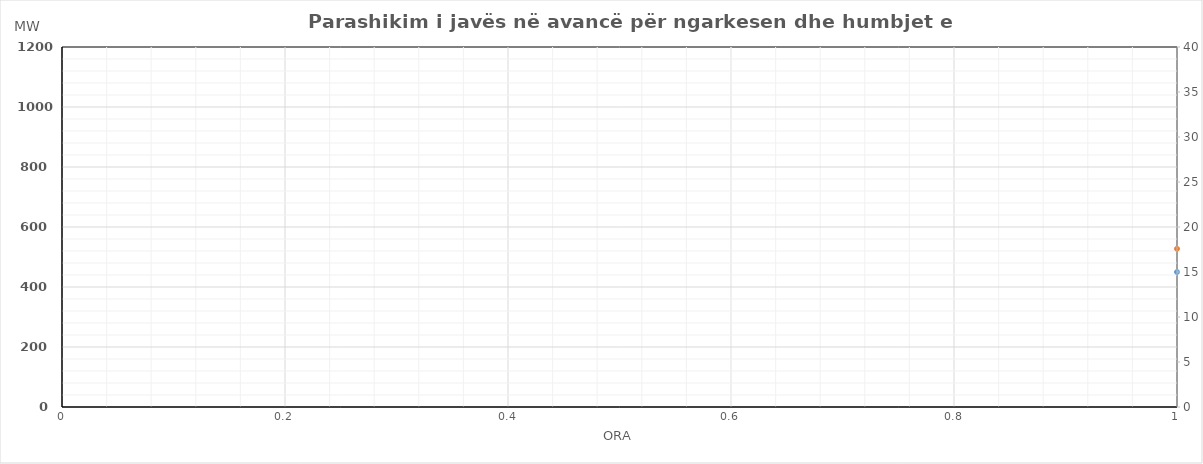
| Category | Ngarkesa (MWh) |
|---|---|
| 0 | 527.347 |
| 1 | 463.06 |
| 2 | 443.983 |
| 3 | 436.306 |
| 4 | 446.912 |
| 5 | 505.168 |
| 6 | 675.854 |
| 7 | 905.98 |
| 8 | 973.923 |
| 9 | 953.927 |
| 10 | 930.497 |
| 11 | 918.928 |
| 12 | 899.087 |
| 13 | 904.908 |
| 14 | 922.401 |
| 15 | 937.886 |
| 16 | 954.486 |
| 17 | 1024.093 |
| 18 | 1100.994 |
| 19 | 1099.393 |
| 20 | 1066.033 |
| 21 | 974.845 |
| 22 | 828.2 |
| 23 | 639.018 |
| 24 | 535.152 |
| 25 | 471.344 |
| 26 | 448.587 |
| 27 | 444.501 |
| 28 | 456.014 |
| 29 | 528.074 |
| 30 | 699.127 |
| 31 | 900.297 |
| 32 | 930.635 |
| 33 | 922.987 |
| 34 | 900.672 |
| 35 | 893.037 |
| 36 | 834.323 |
| 37 | 846.634 |
| 38 | 866.941 |
| 39 | 872.756 |
| 40 | 876.71 |
| 41 | 963.798 |
| 42 | 1089.815 |
| 43 | 1100.957 |
| 44 | 1076.377 |
| 45 | 981.387 |
| 46 | 832.767 |
| 47 | 714.958 |
| 48 | 618.373 |
| 49 | 512.805 |
| 50 | 459.075 |
| 51 | 449.87 |
| 52 | 458.746 |
| 53 | 508.008 |
| 54 | 677.761 |
| 55 | 880.149 |
| 56 | 954.683 |
| 57 | 929.662 |
| 58 | 909.277 |
| 59 | 890.656 |
| 60 | 843.492 |
| 61 | 845.57 |
| 62 | 853.387 |
| 63 | 835.194 |
| 64 | 838.602 |
| 65 | 925.144 |
| 66 | 1006.879 |
| 67 | 1010.599 |
| 68 | 977.22 |
| 69 | 891.842 |
| 70 | 783.752 |
| 71 | 634.6 |
| 72 | 541.642 |
| 73 | 482.566 |
| 74 | 461.938 |
| 75 | 450.582 |
| 76 | 463.727 |
| 77 | 518.988 |
| 78 | 674.054 |
| 79 | 882.85 |
| 80 | 938.167 |
| 81 | 937.595 |
| 82 | 925.114 |
| 83 | 912.127 |
| 84 | 912.029 |
| 85 | 934.976 |
| 86 | 949.743 |
| 87 | 944.216 |
| 88 | 943.178 |
| 89 | 1009.144 |
| 90 | 1075.629 |
| 91 | 1067.174 |
| 92 | 1024.26 |
| 93 | 917.352 |
| 94 | 801.601 |
| 95 | 642.746 |
| 96 | 519.421 |
| 97 | 464.747 |
| 98 | 440.261 |
| 99 | 433.881 |
| 100 | 442.394 |
| 101 | 502.559 |
| 102 | 653.721 |
| 103 | 862.195 |
| 104 | 930.573 |
| 105 | 936.437 |
| 106 | 904.313 |
| 107 | 892.3 |
| 108 | 888.235 |
| 109 | 894.736 |
| 110 | 894.237 |
| 111 | 888.307 |
| 112 | 899.434 |
| 113 | 972.429 |
| 114 | 1049.229 |
| 115 | 1046.471 |
| 116 | 1011.426 |
| 117 | 908.382 |
| 118 | 767.486 |
| 119 | 627.644 |
| 120 | 535.109 |
| 121 | 477.588 |
| 122 | 452.123 |
| 123 | 444.376 |
| 124 | 454.558 |
| 125 | 510.048 |
| 126 | 622.303 |
| 127 | 786.201 |
| 128 | 911.504 |
| 129 | 951.888 |
| 130 | 951.405 |
| 131 | 954.013 |
| 132 | 944.42 |
| 133 | 956.187 |
| 134 | 944.801 |
| 135 | 938.491 |
| 136 | 948.654 |
| 137 | 1007.957 |
| 138 | 1077.299 |
| 139 | 1076.642 |
| 140 | 1044.588 |
| 141 | 939.694 |
| 142 | 815.88 |
| 143 | 705.729 |
| 144 | 665.739 |
| 145 | 582.709 |
| 146 | 543.756 |
| 147 | 526.037 |
| 148 | 537.254 |
| 149 | 542.653 |
| 150 | 621.109 |
| 151 | 727.815 |
| 152 | 806.656 |
| 153 | 838.775 |
| 154 | 858.14 |
| 155 | 829.869 |
| 156 | 832.783 |
| 157 | 852.028 |
| 158 | 822.467 |
| 159 | 808.254 |
| 160 | 818.968 |
| 161 | 922.359 |
| 162 | 1054.528 |
| 163 | 1090.291 |
| 164 | 1067.525 |
| 165 | 983.056 |
| 166 | 825.276 |
| 167 | 642.713 |